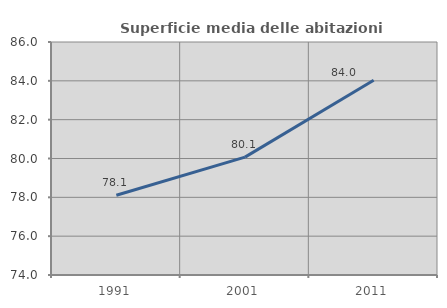
| Category | Superficie media delle abitazioni occupate |
|---|---|
| 1991.0 | 78.105 |
| 2001.0 | 80.071 |
| 2011.0 | 84.032 |